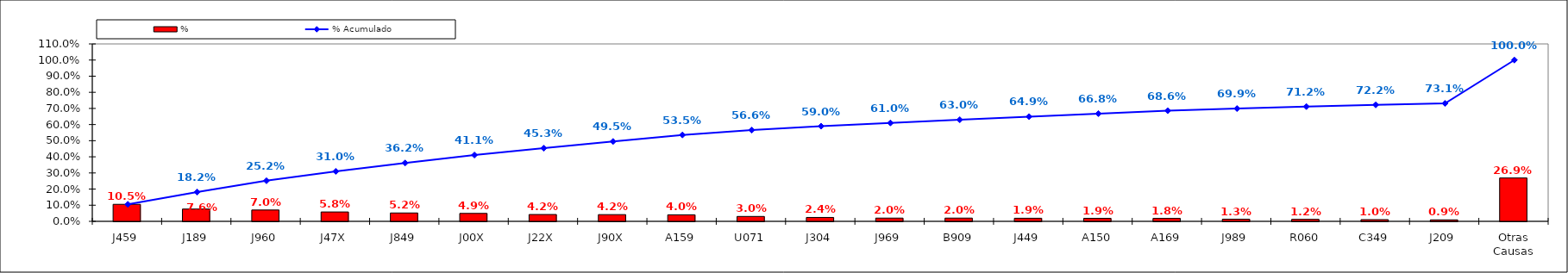
| Category | % |
|---|---|
| J459 | 0.105 |
| J189 | 0.076 |
| J960 | 0.07 |
| J47X | 0.058 |
| J849 | 0.052 |
| J00X | 0.049 |
| J22X | 0.042 |
| J90X | 0.042 |
| A159 | 0.04 |
| U071 | 0.03 |
| J304 | 0.024 |
| J969 | 0.02 |
| B909 | 0.02 |
| J449 | 0.019 |
| A150 | 0.019 |
| A169 | 0.018 |
| J989 | 0.013 |
| R060 | 0.012 |
| C349 | 0.01 |
| J209 | 0.009 |
| Otras Causas | 0.269 |